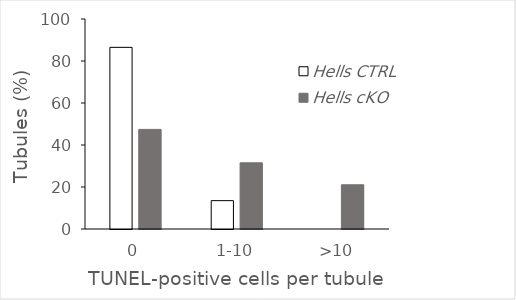
| Category | Hells CTRL | Hells cKO |
|---|---|---|
| 0 | 86.502 | 47.42 |
| 1-10 | 13.498 | 31.518 |
| >10 | 0 | 21.062 |